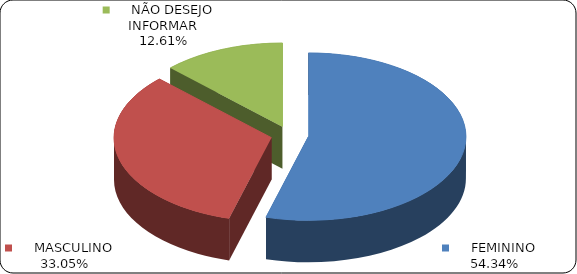
| Category | Series 0 |
|---|---|
|      FEMININO | 0.543 |
|      MASCULINO | 0.331 |
|      NÃO DESEJO INFORMAR | 0.126 |